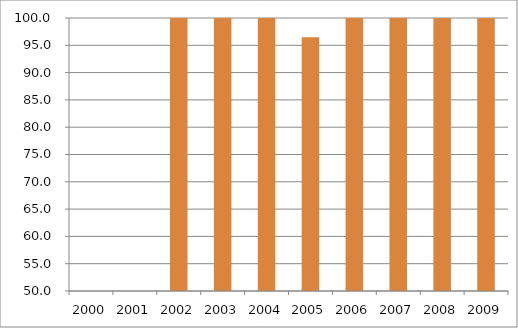
| Category | Região Norte |
|---|---|
| 2000.0 | 0 |
| 2001.0 | 0 |
| 2002.0 | 100.21 |
| 2003.0 | 113.08 |
| 2004.0 | 108.66 |
| 2005.0 | 96.48 |
| 2006.0 | 108.86 |
| 2007.0 | 111.44 |
| 2008.0 | 108.55 |
| 2009.0 | 105.42 |